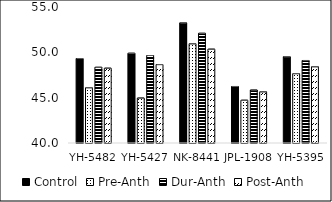
| Category | Control | Pre-Anth | Dur-Anth | Post-Anth |
|---|---|---|---|---|
| YH-5482 | 49.317 | 46.1 | 48.35 | 48.25 |
| YH-5427 | 49.9 | 44.967 | 49.65 | 48.65 |
| NK-8441 | 53.25 | 50.95 | 52.1 | 50.35 |
| JPL-1908 | 46.233 | 44.717 | 45.85 | 45.65 |
| YH-5395 | 49.517 | 47.65 | 49.1 | 48.417 |